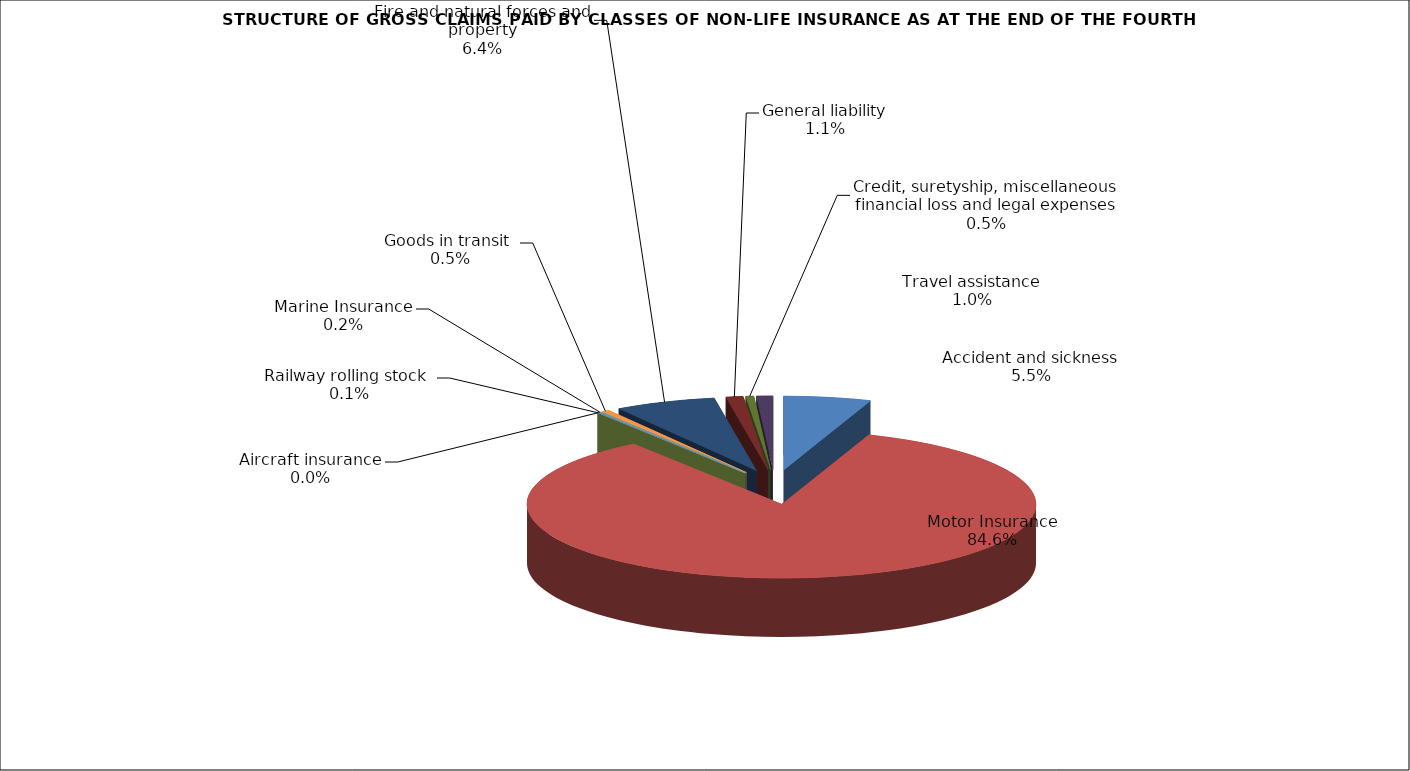
| Category | Accident and sickness |
|---|---|
| Accident and sickness | 0.055 |
| Motor Insurance | 0.846 |
| Railway rolling stock  | 0.001 |
| Aircraft insurance | 0 |
| Marine Insurance | 0.002 |
| Goods in transit  | 0.005 |
| Fire and natural forces and property | 0.064 |
| General liability | 0.011 |
| Credit, suretyship, miscellaneous financial loss and legal expenses | 0.005 |
| Travel assistance | 0.01 |